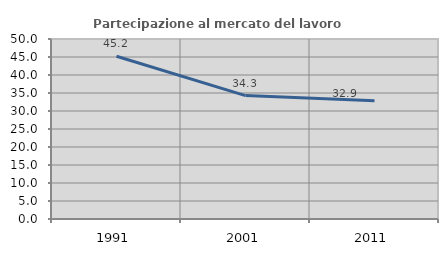
| Category | Partecipazione al mercato del lavoro  femminile |
|---|---|
| 1991.0 | 45.202 |
| 2001.0 | 34.285 |
| 2011.0 | 32.874 |